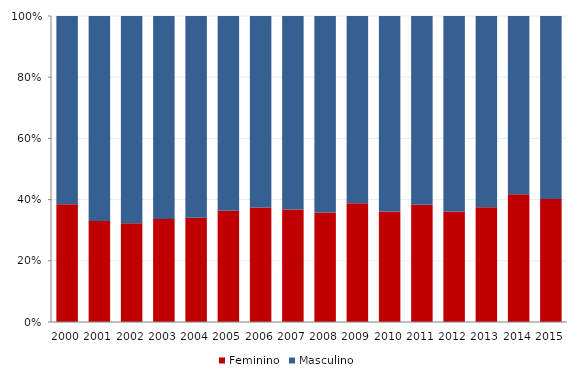
| Category | Feminino | Masculino |
|---|---|---|
| 2000.0 | 38.5 | 61.5 |
| 2001.0 | 33.025 | 66.975 |
| 2002.0 | 32.293 | 67.707 |
| 2003.0 | 33.62 | 66.38 |
| 2004.0 | 34.036 | 65.964 |
| 2005.0 | 36.33 | 63.67 |
| 2006.0 | 37.406 | 62.594 |
| 2007.0 | 36.757 | 63.243 |
| 2008.0 | 35.797 | 64.203 |
| 2009.0 | 38.831 | 61.169 |
| 2010.0 | 36.144 | 63.856 |
| 2011.0 | 38.291 | 61.709 |
| 2012.0 | 36.15 | 63.85 |
| 2013.0 | 37.518 | 62.482 |
| 2014.0 | 41.77 | 58.23 |
| 2015.0 | 40.199 | 59.801 |